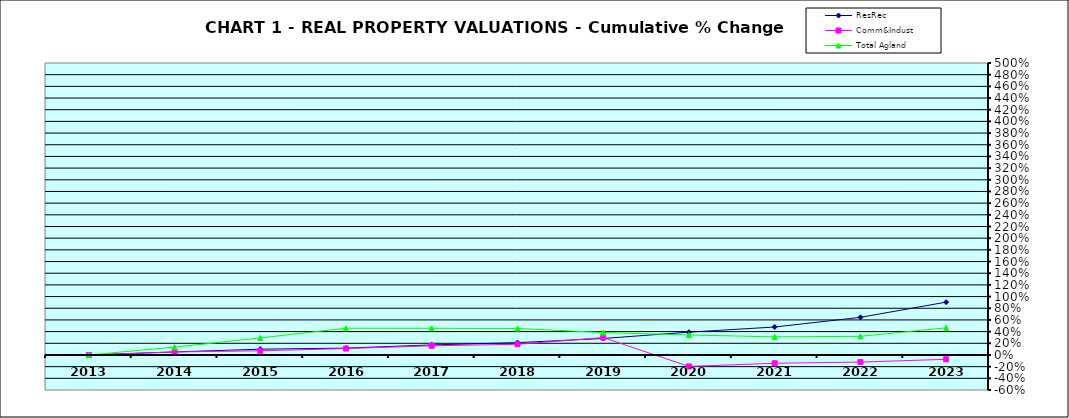
| Category | ResRec | Comm&Indust | Total Agland |
|---|---|---|---|
| 2013.0 | 0 | 0 | 0 |
| 2014.0 | 0.051 | 0.052 | 0.134 |
| 2015.0 | 0.099 | 0.072 | 0.292 |
| 2016.0 | 0.117 | 0.11 | 0.458 |
| 2017.0 | 0.172 | 0.158 | 0.457 |
| 2018.0 | 0.211 | 0.183 | 0.454 |
| 2019.0 | 0.282 | 0.298 | 0.384 |
| 2020.0 | 0.391 | -0.196 | 0.343 |
| 2021.0 | 0.479 | -0.142 | 0.31 |
| 2022.0 | 0.644 | -0.122 | 0.32 |
| 2023.0 | 0.905 | -0.074 | 0.464 |